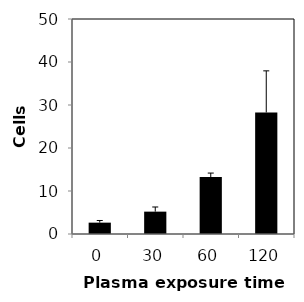
| Category | Apoptosis |
|---|---|
| 0.0 | 2.64 |
| 30.0 | 5.2 |
| 60.0 | 13.25 |
| 120.0 | 28.26 |